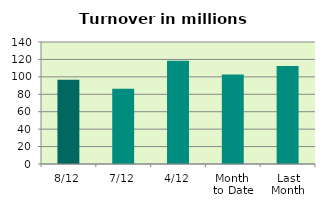
| Category | Series 0 |
|---|---|
| 8/12 | 96.75 |
| 7/12 | 86.452 |
| 4/12 | 118.58 |
| Month 
to Date | 102.826 |
| Last
Month | 112.501 |